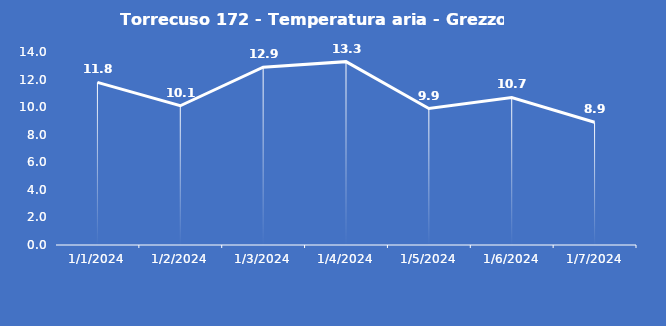
| Category | Torrecuso 172 - Temperatura aria - Grezzo (°C) |
|---|---|
| 1/1/24 | 11.8 |
| 1/2/24 | 10.1 |
| 1/3/24 | 12.9 |
| 1/4/24 | 13.3 |
| 1/5/24 | 9.9 |
| 1/6/24 | 10.7 |
| 1/7/24 | 8.9 |